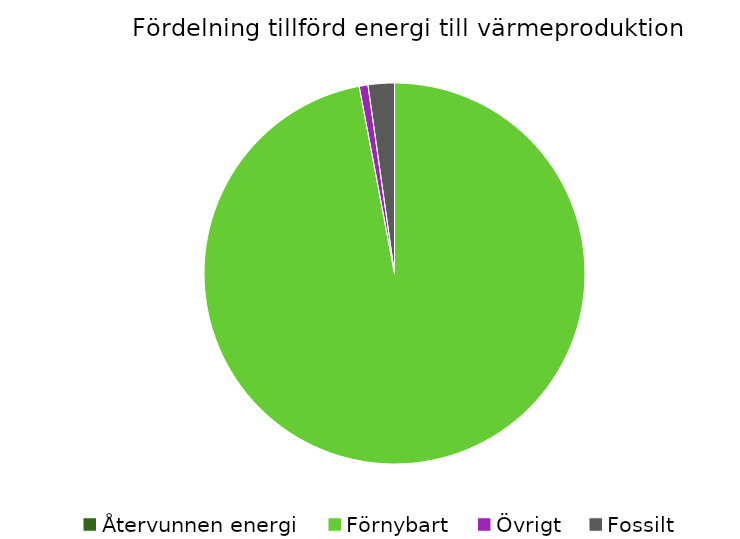
| Category | Fördelning värmeproduktion |
|---|---|
| Återvunnen energi | 0 |
| Förnybart | 0.97 |
| Övrigt | 0.007 |
| Fossilt | 0.022 |